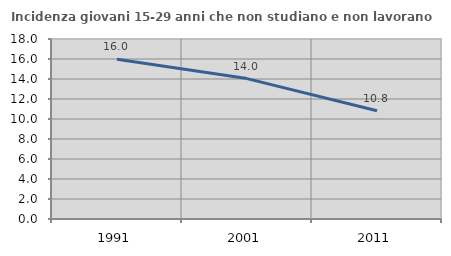
| Category | Incidenza giovani 15-29 anni che non studiano e non lavorano  |
|---|---|
| 1991.0 | 15.985 |
| 2001.0 | 14.04 |
| 2011.0 | 10.828 |